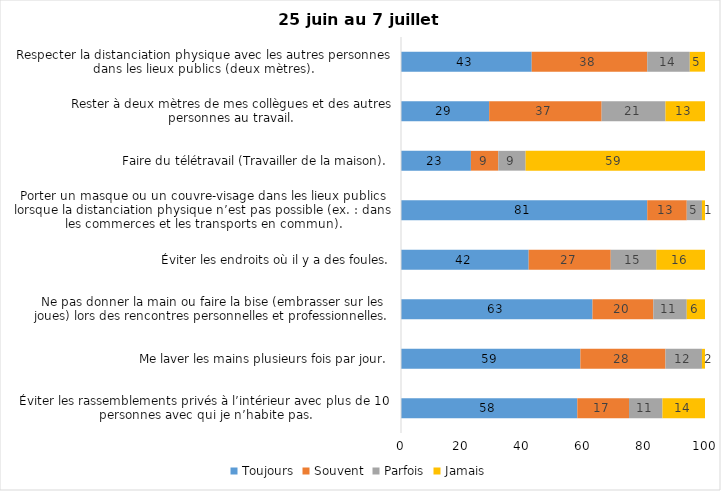
| Category | Toujours | Souvent | Parfois | Jamais |
|---|---|---|---|---|
| Éviter les rassemblements privés à l’intérieur avec plus de 10 personnes avec qui je n’habite pas. | 58 | 17 | 11 | 14 |
| Me laver les mains plusieurs fois par jour. | 59 | 28 | 12 | 2 |
| Ne pas donner la main ou faire la bise (embrasser sur les joues) lors des rencontres personnelles et professionnelles. | 63 | 20 | 11 | 6 |
| Éviter les endroits où il y a des foules. | 42 | 27 | 15 | 16 |
| Porter un masque ou un couvre-visage dans les lieux publics lorsque la distanciation physique n’est pas possible (ex. : dans les commerces et les transports en commun). | 81 | 13 | 5 | 1 |
| Faire du télétravail (Travailler de la maison). | 23 | 9 | 9 | 59 |
| Rester à deux mètres de mes collègues et des autres personnes au travail. | 29 | 37 | 21 | 13 |
| Respecter la distanciation physique avec les autres personnes dans les lieux publics (deux mètres). | 43 | 38 | 14 | 5 |